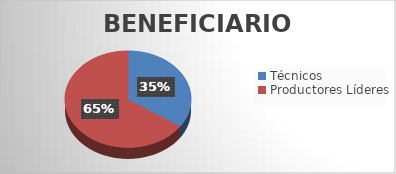
| Category | Series 0 |
|---|---|
| Técnicos | 131 |
| Productores Líderes | 248 |